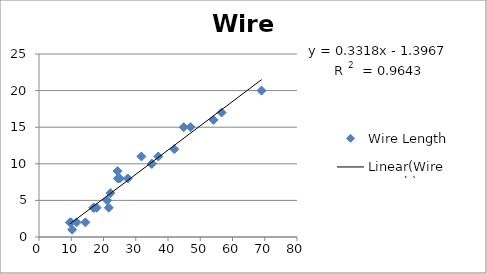
| Category | Wire Length |
|---|---|
| 9.95 | 2 |
| 24.45 | 8 |
| 31.75 | 11 |
| 35.0 | 10 |
| 25.02 | 8 |
| 16.86 | 4 |
| 14.38 | 2 |
| 9.6 | 2 |
| 24.35 | 9 |
| 27.5 | 8 |
| 17.08 | 4 |
| 37.0 | 11 |
| 41.95 | 12 |
| 11.66 | 2 |
| 21.62 | 4 |
| 17.89 | 4 |
| 69.0 | 20 |
| 10.3 | 1 |
| 34.93 | 10 |
| 46.99 | 15 |
| 44.88 | 15 |
| 54.12 | 16 |
| 56.63 | 17 |
| 22.13 | 6 |
| 21.15 | 5 |